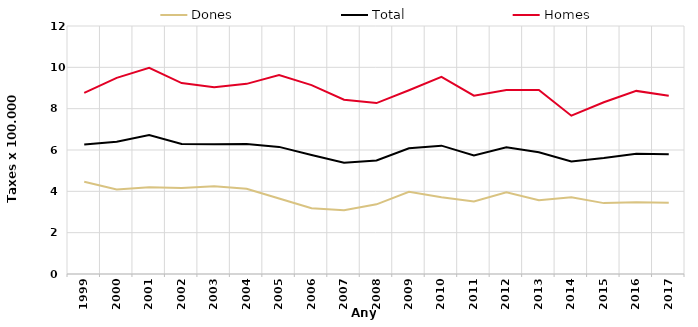
| Category | Dones | Total | Homes |
|---|---|---|---|
| 1999.0 | 4.46 | 6.27 | 8.76 |
| 2000.0 | 4.09 | 6.4 | 9.49 |
| 2001.0 | 4.2 | 6.73 | 9.98 |
| 2002.0 | 4.16 | 6.29 | 9.24 |
| 2003.0 | 4.24 | 6.28 | 9.04 |
| 2004.0 | 4.12 | 6.29 | 9.2 |
| 2005.0 | 3.65 | 6.15 | 9.63 |
| 2006.0 | 3.18 | 5.76 | 9.14 |
| 2007.0 | 3.09 | 5.38 | 8.43 |
| 2008.0 | 3.37 | 5.49 | 8.27 |
| 2009.0 | 3.98 | 6.08 | 8.89 |
| 2010.0 | 3.71 | 6.21 | 9.54 |
| 2011.0 | 3.51 | 5.73 | 8.63 |
| 2012.0 | 3.95 | 6.13 | 8.9 |
| 2013.0 | 3.57 | 5.89 | 8.9 |
| 2014.0 | 3.71 | 5.44 | 7.66 |
| 2015.0 | 3.43 | 5.61 | 8.31 |
| 2016.0 | 3.47 | 5.82 | 8.86 |
| 2017.0 | 3.45 | 5.79 | 8.62 |